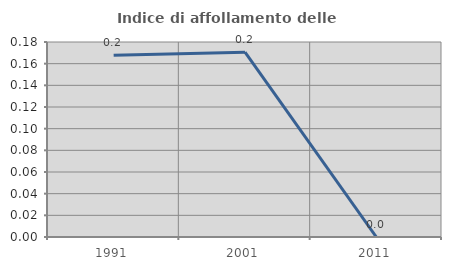
| Category | Indice di affollamento delle abitazioni  |
|---|---|
| 1991.0 | 0.168 |
| 2001.0 | 0.171 |
| 2011.0 | 0 |